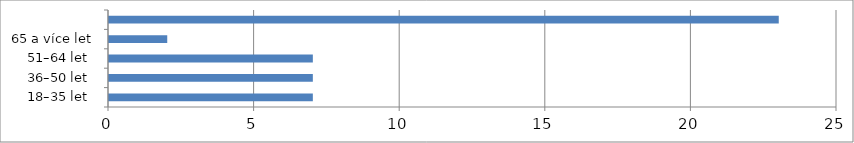
| Category | Series 0 |
|---|---|
| 18–35 let  | 7 |
| 36–50 let  | 7 |
| 51–64 let  | 7 |
| 65 a více let | 2 |